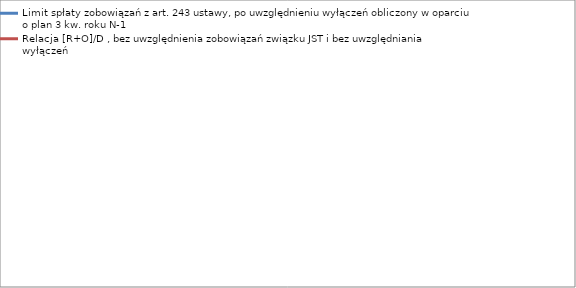
| Category | Limit spłaty zobowiązań z art. 243 ustawy, po uwzględnieniu wyłączeń obliczony w oparciu o plan 3 kw. roku N-1 | Relacja [R+O]/D , bez uwzględnienia zobowiązań związku JST i bez uwzględniania wyłączeń |
|---|---|---|
| 2014.0 | 0.189 | 0.058 |
| 2015.0 | 0.219 | 0 |
| 2016.0 | 0.183 | 0 |
| 2017.0 | 0.188 | 0 |